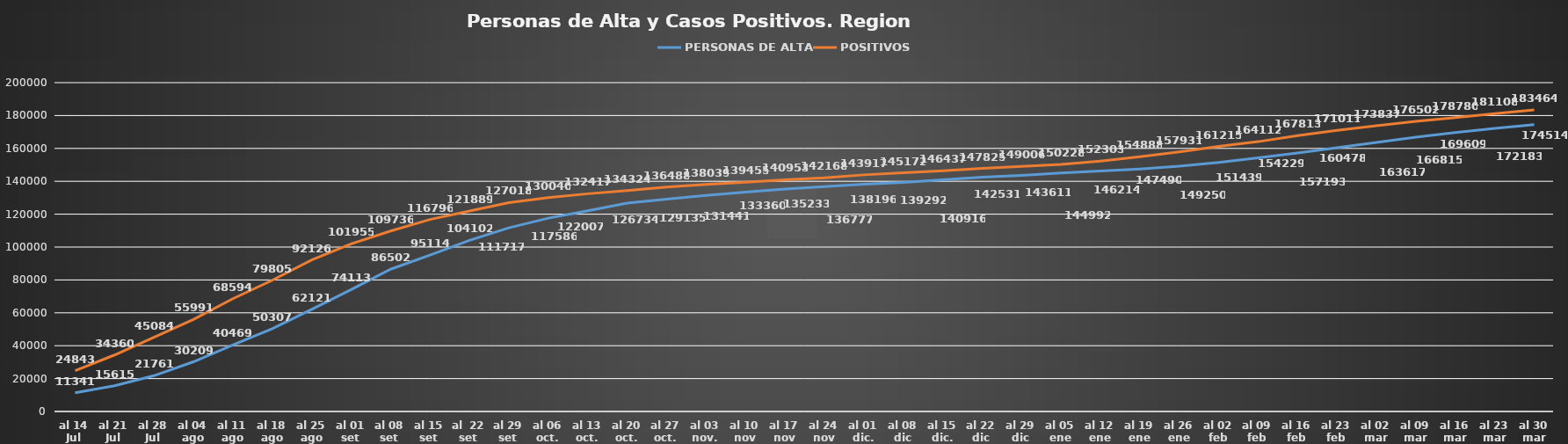
| Category | PERSONAS DE ALTA | POSITIVOS |
|---|---|---|
| al 14 Jul | 11341 | 24843 |
| al 21 Jul | 15615 | 34360 |
| al 28 Jul | 21761 | 45084 |
| al 04 ago | 30209 | 55991 |
| al 11 ago | 40469 | 68594 |
| al 18 ago | 50307 | 79805 |
| al 25 ago | 62121 | 92126 |
| al 01 set | 74113 | 101955 |
| al 08 set | 86502 | 109736 |
| al 15 set | 95114 | 116796 |
| al  22 set | 104102 | 121889 |
| al 29 set | 111717 | 127018 |
| al 06 oct. | 117586 | 130040 |
| al 13 oct. | 122007 | 132417 |
| al 20 oct. | 126734 | 134324 |
| al 27 oct. | 129135 | 136488 |
| al 03 nov. | 131441 | 138039 |
| al 10 nov | 133360 | 139455 |
| al 17 nov | 135233 | 140953 |
| al 24 nov | 136777 | 142168 |
| al 01 dic. | 138196 | 143917 |
| al 08 dic | 139292 | 145172 |
| al 15 dic. | 140916 | 146437 |
| al 22 dic | 142531 | 147825 |
| al 29 dic | 143611 | 149006 |
| al 05 ene | 144992 | 150228 |
| al 12 ene | 146214 | 152303 |
| al 19 ene | 147490 | 154888 |
| al 26 ene | 149250 | 157931 |
| al 02 feb | 151439 | 161215 |
| al 09 feb | 154229 | 164112 |
| al 16 feb | 157193 | 167813 |
| al 23 feb | 160478 | 171011 |
| al 02 mar | 163617 | 173837 |
| al 09 mar | 166815 | 176502 |
| al 16 mar | 169609 | 178780 |
| al 23 mar | 172183 | 181108 |
| al 30 mar | 174514 | 183464 |